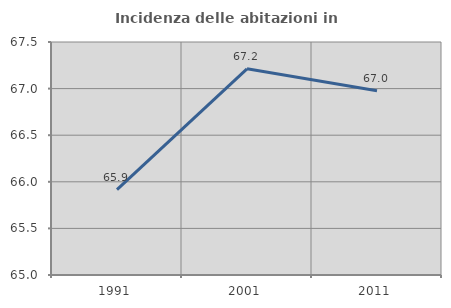
| Category | Incidenza delle abitazioni in proprietà  |
|---|---|
| 1991.0 | 65.915 |
| 2001.0 | 67.212 |
| 2011.0 | 66.977 |